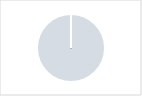
| Category | Series 0 |
|---|---|
| 0 | 0 |
| 1 | 6 |